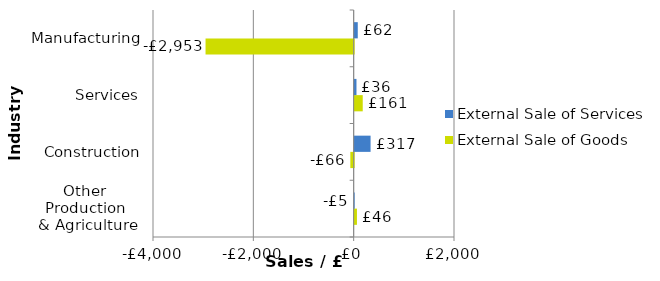
| Category | External Sale of Goods | External Sale of Services |
|---|---|---|
| Other 
Production 
& Agriculture
 | 45.532 | -4.61 |
| Construction | -66.437 | 317.172 |
| Services | 160.893 | 36.075 |
| Manufacturing | -2952.535 | 61.848 |